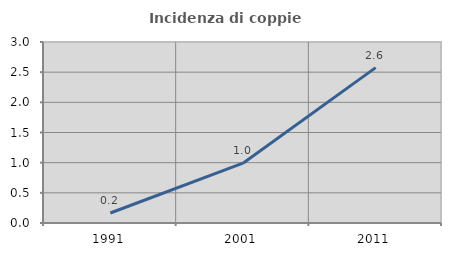
| Category | Incidenza di coppie miste |
|---|---|
| 1991.0 | 0.165 |
| 2001.0 | 0.992 |
| 2011.0 | 2.575 |